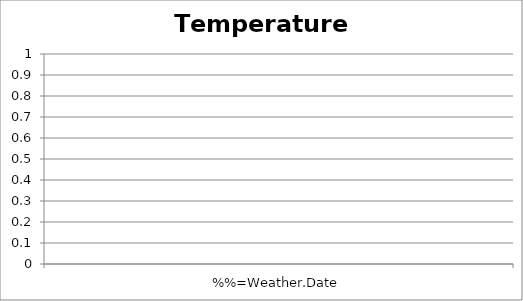
| Category | Temperature (F) |
|---|---|
| %%=Weather.Date | 0 |